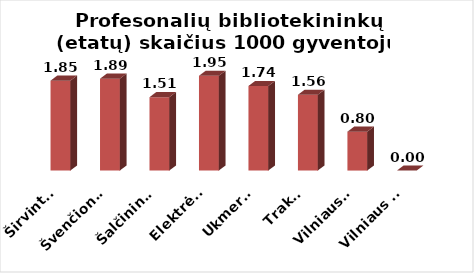
| Category | Series 0 |
|---|---|
| Širvintos | 1.85 |
| Švenčionys | 1.89 |
| Šalčininkai | 1.51 |
| Elektrėnai | 1.95 |
| Ukmergė | 1.74 |
| Trakai | 1.56 |
| Vilniaus r. | 0.8 |
| Vilniaus m. | 0 |